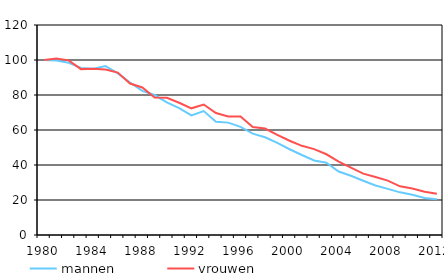
| Category | mannen | vrouwen |
|---|---|---|
| 1980.0 | 100 | 100 |
| 1981.0 | 99.697 | 100.838 |
| 1982.0 | 98.448 | 99.806 |
| 1983.0 | 95.498 | 94.788 |
| 1984.0 | 95.066 | 94.97 |
| 1985.0 | 96.51 | 94.582 |
| 1986.0 | 92.345 | 92.824 |
| 1987.0 | 87.116 | 86.543 |
| 1988.0 | 82.316 | 84.328 |
| 1989.0 | 79.983 | 78.585 |
| 1990.0 | 75.758 | 78.361 |
| 1991.0 | 72.521 | 75.553 |
| 1992.0 | 68.301 | 72.384 |
| 1993.0 | 70.839 | 74.547 |
| 1994.0 | 64.74 | 69.684 |
| 1995.0 | 64.216 | 67.756 |
| 1996.0 | 61.765 | 67.72 |
| 1997.0 | 57.893 | 61.708 |
| 1998.0 | 55.824 | 60.844 |
| 1999.0 | 52.664 | 57.156 |
| 2000.0 | 48.998 | 53.879 |
| 2001.0 | 45.7 | 50.972 |
| 2002.0 | 42.619 | 49.058 |
| 2003.0 | 41.341 | 46.133 |
| 2004.0 | 36.267 | 41.966 |
| 2005.0 | 33.855 | 38.449 |
| 2006.0 | 31.025 | 35.092 |
| 2007.0 | 28.324 | 33.115 |
| 2008.0 | 26.351 | 31.079 |
| 2009.0 | 24.376 | 27.795 |
| 2010.0 | 22.946 | 26.597 |
| 2011.0 | 21.177 | 24.716 |
| 2012.0 | 20.385 | 23.53 |